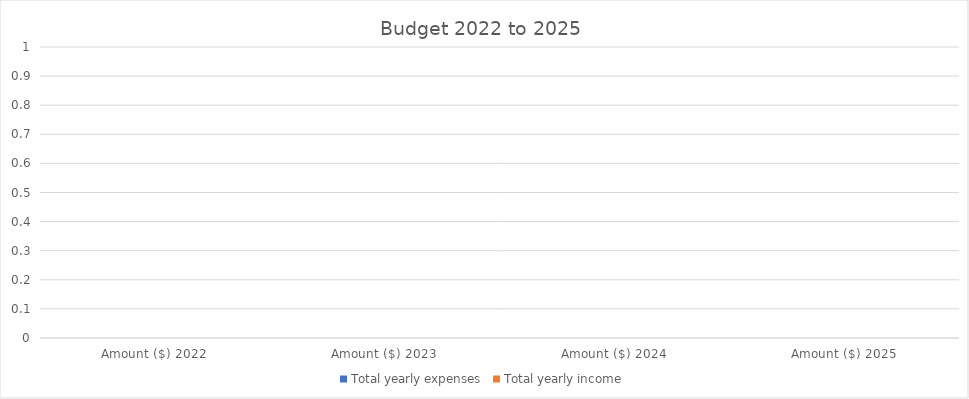
| Category | Total yearly expenses | Total yearly income |
|---|---|---|
| Amount ($) 2022 | 0 | 0 |
| Amount ($) 2023 | 0 | 0 |
| Amount ($) 2024 | 0 | 0 |
| Amount ($) 2025 | 0 | 0 |